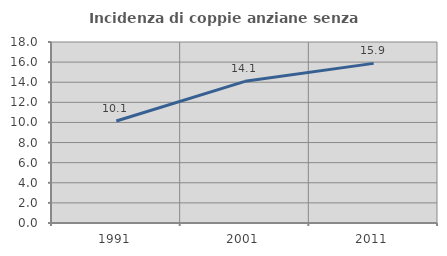
| Category | Incidenza di coppie anziane senza figli  |
|---|---|
| 1991.0 | 10.148 |
| 2001.0 | 14.09 |
| 2011.0 | 15.873 |